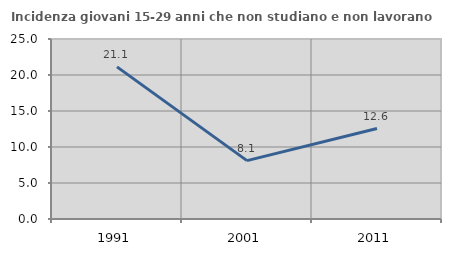
| Category | Incidenza giovani 15-29 anni che non studiano e non lavorano  |
|---|---|
| 1991.0 | 21.127 |
| 2001.0 | 8.108 |
| 2011.0 | 12.563 |